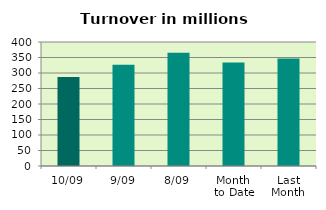
| Category | Series 0 |
|---|---|
| 10/09 | 287.28 |
| 9/09 | 326.679 |
| 8/09 | 365.139 |
| Month 
to Date | 333.564 |
| Last
Month | 347.074 |